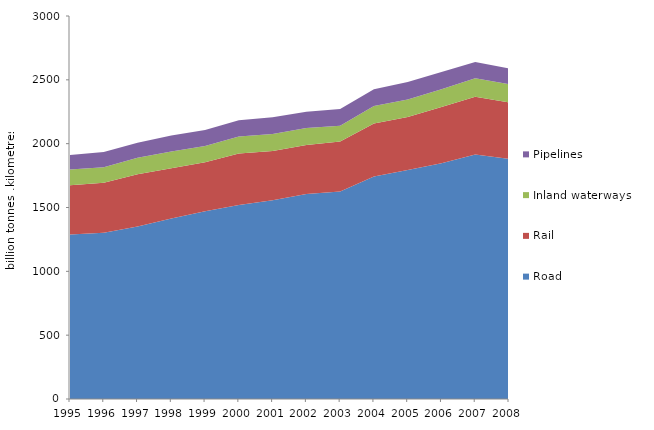
| Category | Road | Rail | Inland waterways | Pipelines |
|---|---|---|---|---|
| 1995.0 | 1288.66 | 386.144 | 122.085 | 114.907 |
| 1996.0 | 1302.579 | 392.146 | 119.756 | 119.33 |
| 1997.0 | 1351.678 | 409.537 | 127.848 | 118.179 |
| 1998.0 | 1414.204 | 392.507 | 131.011 | 125.388 |
| 1999.0 | 1469.941 | 383.625 | 128.727 | 124.228 |
| 2000.0 | 1518.706 | 403.676 | 133.861 | 126.679 |
| 2001.0 | 1556.267 | 385.974 | 132.529 | 133.04 |
| 2002.0 | 1605.898 | 383.777 | 132.504 | 128.446 |
| 2003.0 | 1625.437 | 391.888 | 123.515 | 130.353 |
| 2004.0 | 1742.101 | 416.271 | 136.734 | 131.647 |
| 2005.0 | 1794.006 | 414.134 | 138.662 | 136.003 |
| 2006.0 | 1847.572 | 440.399 | 138.461 | 135.379 |
| 2007.0 | 1914.456 | 453.135 | 144.929 | 127.356 |
| 2008.0 | 1880.501 | 442.821 | 143.166 | 123.746 |